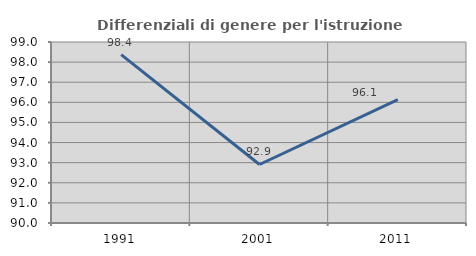
| Category | Differenziali di genere per l'istruzione superiore |
|---|---|
| 1991.0 | 98.376 |
| 2001.0 | 92.909 |
| 2011.0 | 96.131 |